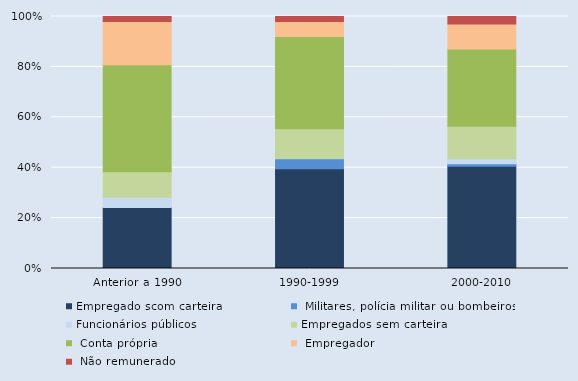
| Category | Empregado scom carteira |  Militares, polícia militar ou bombeiros | Funcionários públicos | Empregados sem carteira |  Conta própria |  Empregador |  Não remunerado |
|---|---|---|---|---|---|---|---|
| Anterior a 1990 | 24 | 0 | 4 | 10 | 42 | 17 | 2 |
| 1990-1999 | 40 | 4 | 0 | 12 | 37 | 6 | 2 |
| 2000-2010 | 41 | 1 | 2 | 13 | 31 | 10 | 3 |